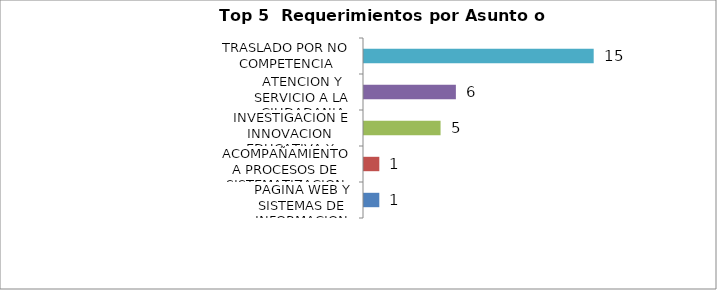
| Category | Total |
|---|---|
| PAGINA WEB Y SISTEMAS DE INFORMACION | 1 |
| ACOMPAÑAMIENTO A PROCESOS DE SISTEMATIZACION DE EXPERIENCIAS, INVESTIGACION E INNOVACION EDUCATIVA Y PEDAGOGICA | 1 |
| ATENCION Y SERVICIO A LA CIUDADANIA | 5 |
| TRASLADO POR NO COMPETENCIA | 6 |
| TEMAS DE CONTRATACION: PERSONAL/RECURSOS FISICOS | 15 |